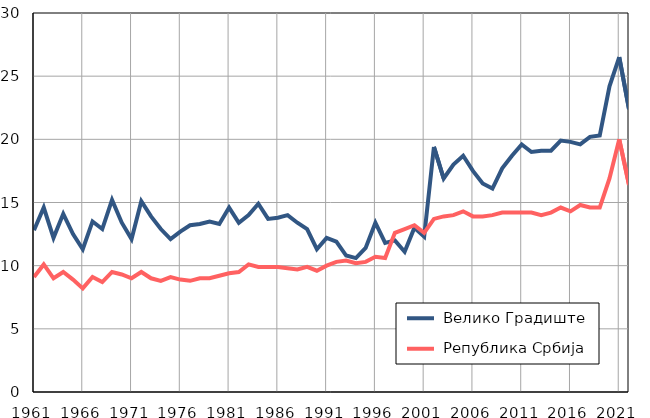
| Category |  Велико Градиште |  Република Србија |
|---|---|---|
| 1961.0 | 12.8 | 9.1 |
| 1962.0 | 14.6 | 10.1 |
| 1963.0 | 12.2 | 9 |
| 1964.0 | 14.1 | 9.5 |
| 1965.0 | 12.5 | 8.9 |
| 1966.0 | 11.3 | 8.2 |
| 1967.0 | 13.5 | 9.1 |
| 1968.0 | 12.9 | 8.7 |
| 1969.0 | 15.2 | 9.5 |
| 1970.0 | 13.4 | 9.3 |
| 1971.0 | 12.1 | 9 |
| 1972.0 | 15.1 | 9.5 |
| 1973.0 | 13.9 | 9 |
| 1974.0 | 12.9 | 8.8 |
| 1975.0 | 12.1 | 9.1 |
| 1976.0 | 12.7 | 8.9 |
| 1977.0 | 13.2 | 8.8 |
| 1978.0 | 13.3 | 9 |
| 1979.0 | 13.5 | 9 |
| 1980.0 | 13.3 | 9.2 |
| 1981.0 | 14.6 | 9.4 |
| 1982.0 | 13.4 | 9.5 |
| 1983.0 | 14 | 10.1 |
| 1984.0 | 14.9 | 9.9 |
| 1985.0 | 13.7 | 9.9 |
| 1986.0 | 13.8 | 9.9 |
| 1987.0 | 14 | 9.8 |
| 1988.0 | 13.4 | 9.7 |
| 1989.0 | 12.9 | 9.9 |
| 1990.0 | 11.3 | 9.6 |
| 1991.0 | 12.2 | 10 |
| 1992.0 | 11.9 | 10.3 |
| 1993.0 | 10.8 | 10.4 |
| 1994.0 | 10.6 | 10.2 |
| 1995.0 | 11.4 | 10.3 |
| 1996.0 | 13.4 | 10.7 |
| 1997.0 | 11.8 | 10.6 |
| 1998.0 | 12 | 12.6 |
| 1999.0 | 11.1 | 12.9 |
| 2000.0 | 13 | 13.2 |
| 2001.0 | 12.3 | 12.6 |
| 2002.0 | 19.4 | 13.7 |
| 2003.0 | 16.9 | 13.9 |
| 2004.0 | 18 | 14 |
| 2005.0 | 18.7 | 14.3 |
| 2006.0 | 17.5 | 13.9 |
| 2007.0 | 16.5 | 13.9 |
| 2008.0 | 16.1 | 14 |
| 2009.0 | 17.7 | 14.2 |
| 2010.0 | 18.7 | 14.2 |
| 2011.0 | 19.6 | 14.2 |
| 2012.0 | 19 | 14.2 |
| 2013.0 | 19.1 | 14 |
| 2014.0 | 19.1 | 14.2 |
| 2015.0 | 19.9 | 14.6 |
| 2016.0 | 19.8 | 14.3 |
| 2017.0 | 19.6 | 14.8 |
| 2018.0 | 20.2 | 14.6 |
| 2019.0 | 20.3 | 14.6 |
| 2020.0 | 24.2 | 16.9 |
| 2021.0 | 26.5 | 20 |
| 2022.0 | 22.4 | 16.4 |